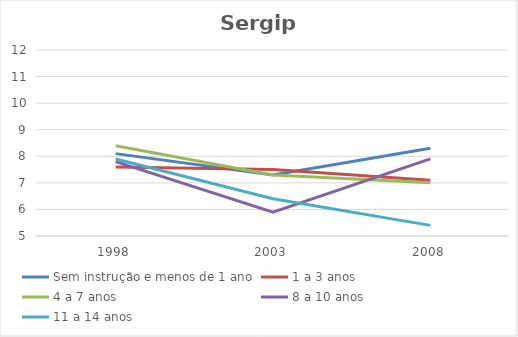
| Category | Sem instrução e menos de 1 ano | 1 a 3 anos | 4 a 7 anos | 8 a 10 anos | 11 a 14 anos |
|---|---|---|---|---|---|
| 1998.0 | 8.1 | 7.6 | 8.4 | 7.8 | 7.9 |
| 2003.0 | 7.3 | 7.5 | 7.3 | 5.9 | 6.4 |
| 2008.0 | 8.3 | 7.1 | 7 | 7.9 | 5.4 |